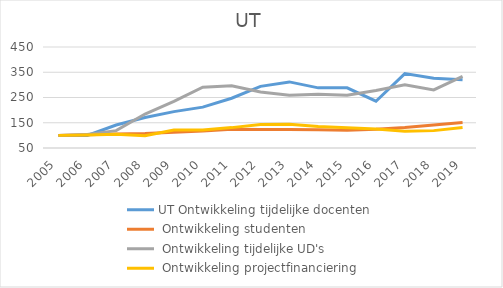
| Category | UT |
|---|---|
| 2005.0 | 100 |
| 2006.0 | 101.881 |
| 2007.0 | 104.075 |
| 2008.0 | 98.433 |
| 2009.0 | 121.003 |
| 2010.0 | 121.317 |
| 2011.0 | 130.721 |
| 2012.0 | 142.79 |
| 2013.0 | 144.201 |
| 2014.0 | 134.796 |
| 2015.0 | 130.408 |
| 2016.0 | 125.549 |
| 2017.0 | 116.614 |
| 2018.0 | 118.809 |
| 2019.0 | 131.505 |